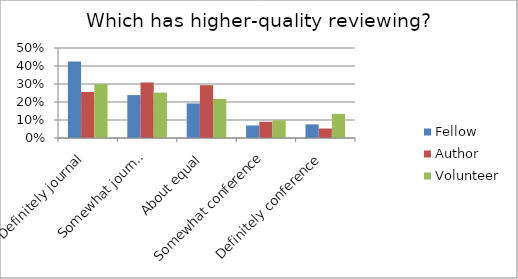
| Category | Fellow | Author | Volunteer |
|---|---|---|---|
| Definitely journal | 0.424 | 0.256 | 0.299 |
| Somewhat journal | 0.238 | 0.308 | 0.252 |
| About equal | 0.192 | 0.293 | 0.217 |
| Somewhat conference | 0.07 | 0.09 | 0.098 |
| Definitely conference | 0.076 | 0.053 | 0.134 |